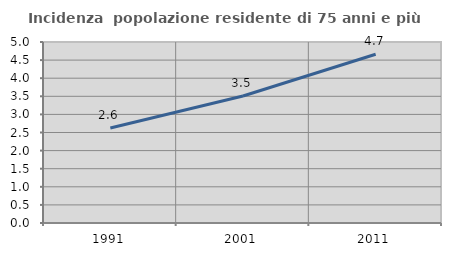
| Category | Incidenza  popolazione residente di 75 anni e più |
|---|---|
| 1991.0 | 2.623 |
| 2001.0 | 3.508 |
| 2011.0 | 4.662 |